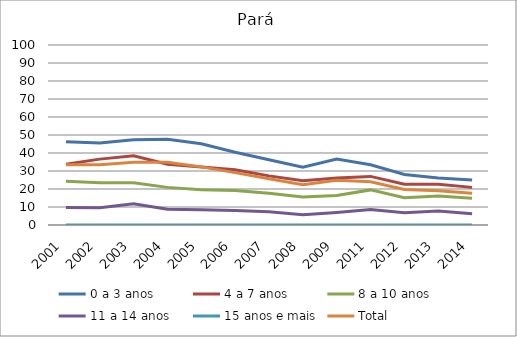
| Category | 0 a 3 anos | 4 a 7 anos | 8 a 10 anos | 11 a 14 anos | 15 anos e mais | Total |
|---|---|---|---|---|---|---|
| 2001.0 | 46.2 | 33.8 | 24.3 | 9.7 | 0 | 33.5 |
| 2002.0 | 45.6 | 36.6 | 23.5 | 9.6 | 0 | 33.5 |
| 2003.0 | 47.3 | 38.4 | 23.5 | 11.8 | 0 | 34.8 |
| 2004.0 | 47.6 | 33.8 | 20.9 | 8.8 | 0 | 34.8 |
| 2005.0 | 45.1 | 32.2 | 19.6 | 8.5 | 0 | 32.3 |
| 2006.0 | 40.4 | 30.7 | 19.1 | 8 | 0 | 29.1 |
| 2007.0 | 36.3 | 27.3 | 17.6 | 7.4 | 0 | 25.7 |
| 2008.0 | 32.1 | 24.6 | 15.6 | 5.7 | 0 | 22.4 |
| 2009.0 | 36.7 | 26.1 | 16.4 | 7 | 0 | 24.9 |
| 2011.0 | 33.5 | 27 | 19.5 | 8.6 | 0 | 24 |
| 2012.0 | 28.1 | 22.6 | 15.2 | 6.8 | 0 | 19.7 |
| 2013.0 | 26.1 | 22.6 | 16.1 | 7.8 | 0 | 19 |
| 2014.0 | 25 | 20.9 | 14.9 | 6.2 | 0 | 17.6 |